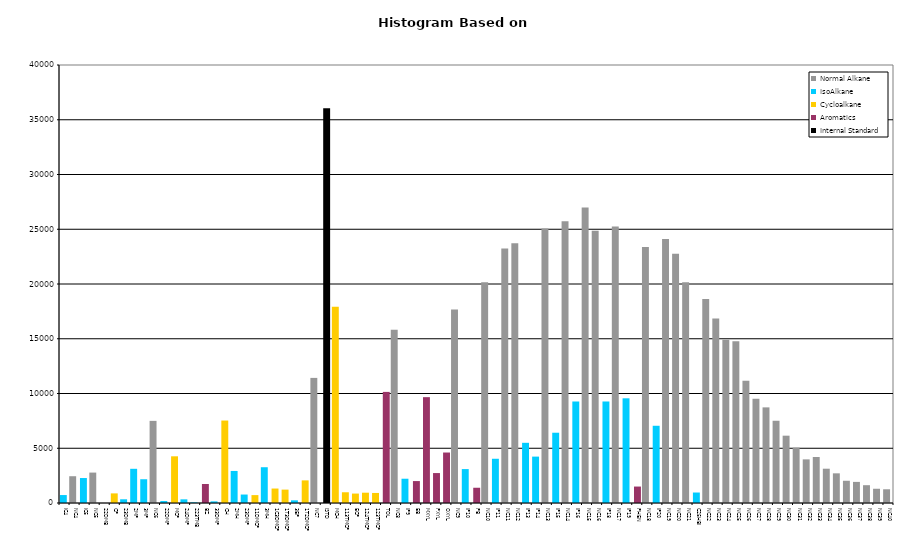
| Category | Normal Alkane | IsoAlkane | Cycloalkane | Aromatics | Internal Standard |
|---|---|---|---|---|---|
| IC4 | 0 | 726 | 0 | 0 | 0 |
| NC4 | 2446 | 0 | 0 | 0 | 0 |
| IC5 | 0 | 2280 | 0 | 0 | 0 |
| NC5 | 2778 | 0 | 0 | 0 | 0 |
| 22DMB | 0 | 0 | 0 | 0 | 0 |
| CP | 0 | 0 | 878 | 0 | 0 |
| 23DMB | 0 | 339 | 0 | 0 | 0 |
| 2MP | 0 | 3123 | 0 | 0 | 0 |
| 3MP | 0 | 2170 | 0 | 0 | 0 |
| NC6 | 7501 | 0 | 0 | 0 | 0 |
| 22DMP | 0 | 180 | 0 | 0 | 0 |
| MCP | 0 | 0 | 4264 | 0 | 0 |
| 24DMP | 0 | 334 | 0 | 0 | 0 |
| 223TMB | 0 | 58 | 0 | 0 | 0 |
| BZ | 0 | 0 | 0 | 1737 | 0 |
| 33DMP | 0 | 149 | 0 | 0 | 0 |
| CH | 0 | 0 | 7531 | 0 | 0 |
| 2MH | 0 | 2927 | 0 | 0 | 0 |
| 23DMP | 0 | 773 | 0 | 0 | 0 |
| 11DMCP | 0 | 0 | 721 | 0 | 0 |
| 3MH | 0 | 3267 | 0 | 0 | 0 |
| 1C3DMCP | 0 | 0 | 1321 | 0 | 0 |
| 1T3DMCP | 0 | 0 | 1223 | 0 | 0 |
| 3EP | 0 | 244 | 0 | 0 | 0 |
| 1T2DMCP | 0 | 0 | 2066 | 0 | 0 |
| NC7 | 11425 | 0 | 0 | 0 | 0 |
| ISTD | 0 | 0 | 0 | 0 | 36040 |
| MCH | 0 | 0 | 17924 | 0 | 0 |
| 113TMCP | 0 | 0 | 980 | 0 | 0 |
| ECP | 0 | 0 | 861 | 0 | 0 |
| 124TMCP | 0 | 0 | 941 | 0 | 0 |
| 123TMCP | 0 | 0 | 917 | 0 | 0 |
| TOL | 0 | 0 | 0 | 10146 | 0 |
| NC8 | 15812 | 0 | 0 | 0 | 0 |
| IP9 | 0 | 2217 | 0 | 0 | 0 |
| EB | 0 | 0 | 0 | 2003 | 0 |
| MXYL | 0 | 0 | 0 | 9666 | 0 |
| PXYL | 0 | 0 | 0 | 2734 | 0 |
| OXYL | 0 | 0 | 0 | 4610 | 0 |
| NC9 | 17675 | 0 | 0 | 0 | 0 |
| IP10 | 0 | 3097 | 0 | 0 | 0 |
| PB | 0 | 0 | 0 | 1393 | 0 |
| NC10 | 20152 | 0 | 0 | 0 | 0 |
| IP11 | 0 | 4040 | 0 | 0 | 0 |
| NC11 | 23241 | 0 | 0 | 0 | 0 |
| NC12 | 23716 | 0 | 0 | 0 | 0 |
| IP13 | 0 | 5497 | 0 | 0 | 0 |
| IP14 | 0 | 4237 | 0 | 0 | 0 |
| NC13 | 25068 | 0 | 0 | 0 | 0 |
| IP15 | 0 | 6418 | 0 | 0 | 0 |
| NC14 | 25742 | 0 | 0 | 0 | 0 |
| IP16 | 0 | 9270 | 0 | 0 | 0 |
| NC15 | 26988 | 0 | 0 | 0 | 0 |
| NC16 | 24853 | 0 | 0 | 0 | 0 |
| IP18 | 0 | 9271 | 0 | 0 | 0 |
| NC17 | 25242 | 0 | 0 | 0 | 0 |
| IP19 | 0 | 9561 | 0 | 0 | 0 |
| PHEN | 0 | 0 | 0 | 1502 | 0 |
| NC18 | 23377 | 0 | 0 | 0 | 0 |
| IP20 | 0 | 7053 | 0 | 0 | 0 |
| NC19 | 24117 | 0 | 0 | 0 | 0 |
| NC20 | 22768 | 0 | 0 | 0 | 0 |
| NC21 | 20169 | 0 | 0 | 0 | 0 |
| C25HBI | 0 | 957 | 0 | 0 | 0 |
| NC22 | 18622 | 0 | 0 | 0 | 0 |
| NC23 | 16853 | 0 | 0 | 0 | 0 |
| NC24 | 14917 | 0 | 0 | 0 | 0 |
| NC25 | 14767 | 0 | 0 | 0 | 0 |
| NC26 | 11166 | 0 | 0 | 0 | 0 |
| NC27 | 9520 | 0 | 0 | 0 | 0 |
| NC28 | 8733 | 0 | 0 | 0 | 0 |
| NC29 | 7511 | 0 | 0 | 0 | 0 |
| NC30 | 6148 | 0 | 0 | 0 | 0 |
| NC31 | 5052 | 0 | 0 | 0 | 0 |
| NC32 | 3984 | 0 | 0 | 0 | 0 |
| NC33 | 4203 | 0 | 0 | 0 | 0 |
| NC34 | 3132 | 0 | 0 | 0 | 0 |
| NC35 | 2709 | 0 | 0 | 0 | 0 |
| NC36 | 2032 | 0 | 0 | 0 | 0 |
| NC37 | 1927 | 0 | 0 | 0 | 0 |
| NC38 | 1626 | 0 | 0 | 0 | 0 |
| NC39 | 1301 | 0 | 0 | 0 | 0 |
| NC40 | 1253 | 0 | 0 | 0 | 0 |